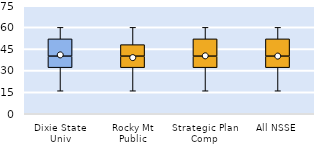
| Category | 25th | 50th | 75th |
|---|---|---|---|
| Dixie State Univ | 32 | 8 | 12 |
| Rocky Mt Public | 32 | 8 | 8 |
| Strategic Plan Comp | 32 | 8 | 12 |
| All NSSE | 32 | 8 | 12 |